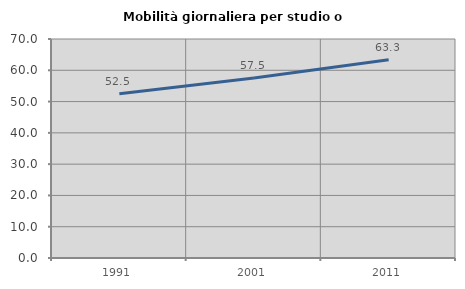
| Category | Mobilità giornaliera per studio o lavoro |
|---|---|
| 1991.0 | 52.504 |
| 2001.0 | 57.539 |
| 2011.0 | 63.333 |